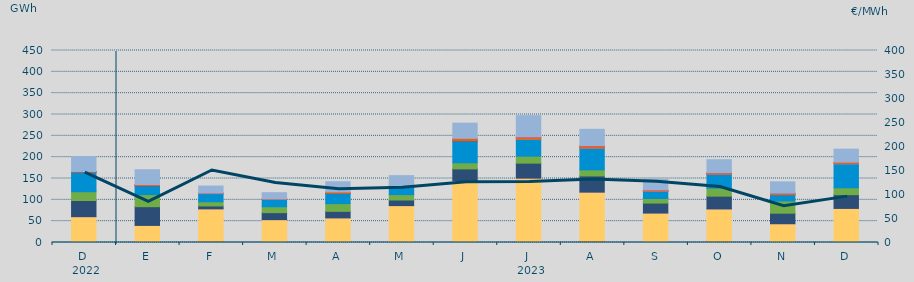
| Category | Carbón | Ciclo Combinado | Cogeneración | Consumo Bombeo | Eólica | Hidráulica | Nuclear | Otras Renovables | Solar fotovoltaica | Solar térmica | Turbinación bombeo |
|---|---|---|---|---|---|---|---|---|---|---|---|
| D | 1126.208 | 59335.684 | 104.85 | 37837.8 | 20596.98 | 45465.168 | 544.3 | 0 | 1011.875 | 1.5 | 35471.986 |
| E | 478.95 | 39560.875 | 26.867 | 43909.242 | 28275.092 | 20601.292 | 143.6 | 0 | 2603.242 | 1.5 | 34937.333 |
| F | 2850.925 | 76083.275 | 1.55 | 6739.65 | 9661.175 | 19240.1 | 0 | 0 | 962.675 | 47.25 | 16781.025 |
| M | 1195.025 | 52392.533 | 3.3 | 16393.158 | 13789.6 | 16980.517 | 40.625 | 4.5 | 911.6 | 43.15 | 14940.475 |
| A | 218.875 | 57485.65 | 46.225 | 15258.175 | 18096.25 | 24086.65 | 63.45 | 0 | 3316.075 | 0 | 23819.559 |
| M | 150.482 | 86315.465 | 30 | 13099.874 | 12607.441 | 17784.926 | 256.325 | 2 | 2256.963 | 1.5 | 24199.004 |
| J | 1968.975 | 142738.351 | 35.225 | 27797.375 | 14167.175 | 51399.925 | 228.125 | 0 | 5290.65 | 319.5 | 35835.25 |
| J | 1606.69 | 149175.946 | 137.975 | 35048.925 | 16290.2 | 39637.497 | 0 | 5 | 4774.95 | 398.125 | 50276.3 |
| A | 2991.569 | 115032.711 | 108.25 | 37912.341 | 14171.547 | 50649.252 | 261.175 | 69.9 | 4696.2 | 414.625 | 38918.209 |
| S | 1098.882 | 67978.9 | 0.25 | 23304.2 | 10673.95 | 16895.894 | 188.6 | 32.7 | 2616.325 | 77.25 | 25361.951 |
| O | 2715.032 | 75984.499 | 16.5 | 29926.75 | 18741.87 | 32145.415 | 710.65 | 39.9 | 2928.133 | 55.25 | 30795.542 |
| N | 172.117 | 43840.328 | 7.5 | 24632.584 | 28628.29 | 14889.19 | 70.15 | 31.25 | 3231.232 | 0.75 | 26664.945 |
| D | 377.1 | 79511.116 | 46.675 | 32172.6 | 15961.085 | 56456.754 | 0 | 3.25 | 3449.06 | 1 | 30839.05 |